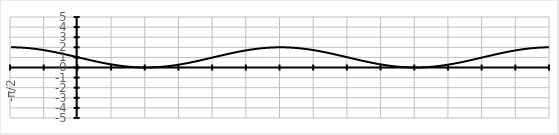
| Category | Series 0 |
|---|---|
| -π/2 | 2 |
|  | 2 |
|  | 1.999 |
|  | 1.999 |
|  | 1.998 |
|  | 1.996 |
|  | 1.995 |
|  | 1.993 |
|  | 1.99 |
|  | 1.988 |
|  | 1.985 |
|  | 1.982 |
|  | 1.978 |
|  | 1.974 |
|  | 1.97 |
|  | 1.966 |
|  | 1.961 |
|  | 1.956 |
|  | 1.951 |
|  | 1.946 |
|  | 1.94 |
|  | 1.934 |
|  | 1.927 |
|  | 1.921 |
|  | 1.914 |
|  | 1.906 |
|  | 1.899 |
|  | 1.891 |
|  | 1.883 |
|  | 1.875 |
|  | 1.866 |
|  | 1.857 |
|  | 1.848 |
|  | 1.839 |
|  | 1.829 |
|  | 1.819 |
|  | 1.809 |
|  | 1.799 |
|  | 1.788 |
|  | 1.777 |
|  | 1.766 |
|  | 1.755 |
|  | 1.743 |
|  | 1.731 |
|  | 1.719 |
|   | 1.707 |
|  | 1.695 |
|  | 1.682 |
|  | 1.669 |
|  | 1.656 |
|  | 1.643 |
|  | 1.629 |
|  | 1.616 |
|  | 1.602 |
|  | 1.588 |
|  | 1.574 |
|  | 1.559 |
|  | 1.545 |
|  | 1.53 |
|  | 1.515 |
|  | 1.5 |
|  | 1.485 |
|  | 1.469 |
|  | 1.454 |
|  | 1.438 |
|  | 1.423 |
|  | 1.407 |
|  | 1.391 |
|  | 1.375 |
|  | 1.358 |
|  | 1.342 |
|  | 1.326 |
|  | 1.309 |
|  | 1.292 |
|  | 1.276 |
|  | 1.259 |
|  | 1.242 |
|  | 1.225 |
|  | 1.208 |
|  | 1.191 |
|  | 1.174 |
|  | 1.156 |
|  | 1.139 |
|  | 1.122 |
|  | 1.105 |
|  | 1.087 |
|  | 1.07 |
|  | 1.052 |
|  | 1.035 |
|  | 1.017 |
| 0 | 1 |
|  | 0.983 |
|  | 0.965 |
|  | 0.948 |
|  | 0.93 |
|  | 0.913 |
|  | 0.895 |
|  | 0.878 |
|  | 0.861 |
|  | 0.844 |
|  | 0.826 |
|  | 0.809 |
|  | 0.792 |
|  | 0.775 |
|  | 0.758 |
|  | 0.741 |
|  | 0.724 |
|  | 0.708 |
|  | 0.691 |
|  | 0.674 |
|  | 0.658 |
|  | 0.642 |
|  | 0.625 |
|  | 0.609 |
|  | 0.593 |
|  | 0.577 |
|  | 0.562 |
|  | 0.546 |
|  | 0.531 |
|  | 0.515 |
|  | 0.5 |
|  | 0.485 |
|  | 0.47 |
|  | 0.455 |
|  | 0.441 |
|  | 0.426 |
|  | 0.412 |
|  | 0.398 |
|  | 0.384 |
|  | 0.371 |
|  | 0.357 |
|  | 0.344 |
|  | 0.331 |
|  | 0.318 |
|  | 0.305 |
|   | 0.293 |
|  | 0.281 |
|  | 0.269 |
|  | 0.257 |
|  | 0.245 |
|  | 0.234 |
|  | 0.223 |
|  | 0.212 |
|  | 0.201 |
|  | 0.191 |
|  | 0.181 |
|  | 0.171 |
|  | 0.161 |
|  | 0.152 |
|  | 0.143 |
|  | 0.134 |
|  | 0.125 |
|  | 0.117 |
|  | 0.109 |
|  | 0.101 |
|  | 0.094 |
|  | 0.086 |
|  | 0.079 |
|  | 0.073 |
|  | 0.066 |
|  | 0.06 |
|  | 0.054 |
|  | 0.049 |
|  | 0.044 |
|  | 0.039 |
|  | 0.034 |
|  | 0.03 |
|  | 0.026 |
|  | 0.022 |
|  | 0.018 |
|  | 0.015 |
|  | 0.012 |
|  | 0.01 |
|  | 0.007 |
|  | 0.005 |
|  | 0.004 |
|  | 0.002 |
|  | 0.001 |
|  | 0.001 |
|  | 0 |
| π/2 | 0 |
|  | 0 |
|  | 0.001 |
|  | 0.001 |
|  | 0.002 |
|  | 0.004 |
|  | 0.005 |
|  | 0.007 |
|  | 0.01 |
|  | 0.012 |
|  | 0.015 |
|  | 0.018 |
|  | 0.022 |
|  | 0.026 |
|  | 0.03 |
|  | 0.034 |
|  | 0.039 |
|  | 0.044 |
|  | 0.049 |
|  | 0.054 |
|  | 0.06 |
|  | 0.066 |
|  | 0.073 |
|  | 0.079 |
|  | 0.086 |
|  | 0.094 |
|  | 0.101 |
|  | 0.109 |
|  | 0.117 |
|  | 0.125 |
|  | 0.134 |
|  | 0.143 |
|  | 0.152 |
|  | 0.161 |
|  | 0.171 |
|  | 0.181 |
|  | 0.191 |
|  | 0.201 |
|  | 0.212 |
|  | 0.223 |
|  | 0.234 |
|  | 0.245 |
|  | 0.257 |
|  | 0.269 |
|  | 0.281 |
|   | 0.293 |
|  | 0.305 |
|  | 0.318 |
|  | 0.331 |
|  | 0.344 |
|  | 0.357 |
|  | 0.371 |
|  | 0.384 |
|  | 0.398 |
|  | 0.412 |
|  | 0.426 |
|  | 0.441 |
|  | 0.455 |
|  | 0.47 |
|  | 0.485 |
|  | 0.5 |
|  | 0.515 |
|  | 0.531 |
|  | 0.546 |
|  | 0.562 |
|  | 0.577 |
|  | 0.593 |
|  | 0.609 |
|  | 0.625 |
|  | 0.642 |
|  | 0.658 |
|  | 0.674 |
|  | 0.691 |
|  | 0.708 |
|  | 0.724 |
|  | 0.741 |
|  | 0.758 |
|  | 0.775 |
|  | 0.792 |
|  | 0.809 |
|  | 0.826 |
|  | 0.844 |
|  | 0.861 |
|  | 0.878 |
|  | 0.895 |
|  | 0.913 |
|  | 0.93 |
|  | 0.948 |
|  | 0.965 |
|  | 0.983 |
| π | 1 |
|  | 1.017 |
|  | 1.035 |
|  | 1.052 |
|  | 1.07 |
|  | 1.087 |
|  | 1.105 |
|  | 1.122 |
|  | 1.139 |
|  | 1.156 |
|  | 1.174 |
|  | 1.191 |
|  | 1.208 |
|  | 1.225 |
|  | 1.242 |
|  | 1.259 |
|  | 1.276 |
|  | 1.292 |
|  | 1.309 |
|  | 1.326 |
|  | 1.342 |
|  | 1.358 |
|  | 1.375 |
|  | 1.391 |
|  | 1.407 |
|  | 1.423 |
|  | 1.438 |
|  | 1.454 |
|  | 1.469 |
|  | 1.485 |
|  | 1.5 |
|  | 1.515 |
|  | 1.53 |
|  | 1.545 |
|  | 1.559 |
|  | 1.574 |
|  | 1.588 |
|  | 1.602 |
|  | 1.616 |
|  | 1.629 |
|  | 1.643 |
|  | 1.656 |
|  | 1.669 |
|  | 1.682 |
|  | 1.695 |
|   | 1.707 |
|  | 1.719 |
|  | 1.731 |
|  | 1.743 |
|  | 1.755 |
|  | 1.766 |
|  | 1.777 |
|  | 1.788 |
|  | 1.799 |
|  | 1.809 |
|  | 1.819 |
|  | 1.829 |
|  | 1.839 |
|  | 1.848 |
|  | 1.857 |
|  | 1.866 |
|  | 1.875 |
|  | 1.883 |
|  | 1.891 |
|  | 1.899 |
|  | 1.906 |
|  | 1.914 |
|  | 1.921 |
|  | 1.927 |
|  | 1.934 |
|  | 1.94 |
|  | 1.946 |
|  | 1.951 |
|  | 1.956 |
|  | 1.961 |
|  | 1.966 |
|  | 1.97 |
|  | 1.974 |
|  | 1.978 |
|  | 1.982 |
|  | 1.985 |
|  | 1.988 |
|  | 1.99 |
|  | 1.993 |
|  | 1.995 |
|  | 1.996 |
|  | 1.998 |
|  | 1.999 |
|  | 1.999 |
|  | 2 |
| 3π/2 | 2 |
|  | 2 |
|  | 1.999 |
|  | 1.999 |
|  | 1.998 |
|  | 1.996 |
|  | 1.995 |
|  | 1.993 |
|  | 1.99 |
|  | 1.988 |
|  | 1.985 |
|  | 1.982 |
|  | 1.978 |
|  | 1.974 |
|  | 1.97 |
|  | 1.966 |
|  | 1.961 |
|  | 1.956 |
|  | 1.951 |
|  | 1.946 |
|  | 1.94 |
|  | 1.934 |
|  | 1.927 |
|  | 1.921 |
|  | 1.914 |
|  | 1.906 |
|  | 1.899 |
|  | 1.891 |
|  | 1.883 |
|  | 1.875 |
|  | 1.866 |
|  | 1.857 |
|  | 1.848 |
|  | 1.839 |
|  | 1.829 |
|  | 1.819 |
|  | 1.809 |
|  | 1.799 |
|  | 1.788 |
|  | 1.777 |
|  | 1.766 |
|  | 1.755 |
|  | 1.743 |
|  | 1.731 |
|  | 1.719 |
|   | 1.707 |
|  | 1.695 |
|  | 1.682 |
|  | 1.669 |
|  | 1.656 |
|  | 1.643 |
|  | 1.629 |
|  | 1.616 |
|  | 1.602 |
|  | 1.588 |
|  | 1.574 |
|  | 1.559 |
|  | 1.545 |
|  | 1.53 |
|  | 1.515 |
|  | 1.5 |
|  | 1.485 |
|  | 1.469 |
|  | 1.454 |
|  | 1.438 |
|  | 1.423 |
|  | 1.407 |
|  | 1.391 |
|  | 1.375 |
|  | 1.358 |
|  | 1.342 |
|  | 1.326 |
|  | 1.309 |
|  | 1.292 |
|  | 1.276 |
|  | 1.259 |
|  | 1.242 |
|  | 1.225 |
|  | 1.208 |
|  | 1.191 |
|  | 1.174 |
|  | 1.156 |
|  | 1.139 |
|  | 1.122 |
|  | 1.105 |
|  | 1.087 |
|  | 1.07 |
|  | 1.052 |
|  | 1.035 |
|  | 1.017 |
| 2π | 1 |
|  | 0.983 |
|  | 0.965 |
|  | 0.948 |
|  | 0.93 |
|  | 0.913 |
|  | 0.895 |
|  | 0.878 |
|  | 0.861 |
|  | 0.844 |
|  | 0.826 |
|  | 0.809 |
|  | 0.792 |
|  | 0.775 |
|  | 0.758 |
|  | 0.741 |
|  | 0.724 |
|  | 0.708 |
|  | 0.691 |
|  | 0.674 |
|  | 0.658 |
|  | 0.642 |
|  | 0.625 |
|  | 0.609 |
|  | 0.593 |
|  | 0.577 |
|  | 0.562 |
|  | 0.546 |
|  | 0.531 |
|  | 0.515 |
|  | 0.5 |
|  | 0.485 |
|  | 0.47 |
|  | 0.455 |
|  | 0.441 |
|  | 0.426 |
|  | 0.412 |
|  | 0.398 |
|  | 0.384 |
|  | 0.371 |
|  | 0.357 |
|  | 0.344 |
|  | 0.331 |
|  | 0.318 |
|  | 0.305 |
|   | 0.293 |
|  | 0.281 |
|  | 0.269 |
|  | 0.257 |
|  | 0.245 |
|  | 0.234 |
|  | 0.223 |
|  | 0.212 |
|  | 0.201 |
|  | 0.191 |
|  | 0.181 |
|  | 0.171 |
|  | 0.161 |
|  | 0.152 |
|  | 0.143 |
|  | 0.134 |
|  | 0.125 |
|  | 0.117 |
|  | 0.109 |
|  | 0.101 |
|  | 0.094 |
|  | 0.086 |
|  | 0.079 |
|  | 0.073 |
|  | 0.066 |
|  | 0.06 |
|  | 0.054 |
|  | 0.049 |
|  | 0.044 |
|  | 0.039 |
|  | 0.034 |
|  | 0.03 |
|  | 0.026 |
|  | 0.022 |
|  | 0.018 |
|  | 0.015 |
|  | 0.012 |
|  | 0.01 |
|  | 0.007 |
|  | 0.005 |
|  | 0.004 |
|  | 0.002 |
|  | 0.001 |
|  | 0.001 |
|  | 0 |
| 5π/2 | 0 |
|  | 0 |
|  | 0.001 |
|  | 0.001 |
|  | 0.002 |
|  | 0.004 |
|  | 0.005 |
|  | 0.007 |
|  | 0.01 |
|  | 0.012 |
|  | 0.015 |
|  | 0.018 |
|  | 0.022 |
|  | 0.026 |
|  | 0.03 |
|  | 0.034 |
|  | 0.039 |
|  | 0.044 |
|  | 0.049 |
|  | 0.054 |
|  | 0.06 |
|  | 0.066 |
|  | 0.073 |
|  | 0.079 |
|  | 0.086 |
|  | 0.094 |
|  | 0.101 |
|  | 0.109 |
|  | 0.117 |
|  | 0.125 |
|  | 0.134 |
|  | 0.143 |
|  | 0.152 |
|  | 0.161 |
|  | 0.171 |
|  | 0.181 |
|  | 0.191 |
|  | 0.201 |
|  | 0.212 |
|  | 0.223 |
|  | 0.234 |
|  | 0.245 |
|  | 0.257 |
|  | 0.269 |
|  | 0.281 |
|   | 0.293 |
|  | 0.305 |
|  | 0.318 |
|  | 0.331 |
|  | 0.344 |
|  | 0.357 |
|  | 0.371 |
|  | 0.384 |
|  | 0.398 |
|  | 0.412 |
|  | 0.426 |
|  | 0.441 |
|  | 0.455 |
|  | 0.47 |
|  | 0.485 |
|  | 0.5 |
|  | 0.515 |
|  | 0.531 |
|  | 0.546 |
|  | 0.562 |
|  | 0.577 |
|  | 0.593 |
|  | 0.609 |
|  | 0.625 |
|  | 0.642 |
|  | 0.658 |
|  | 0.674 |
|  | 0.691 |
|  | 0.708 |
|  | 0.724 |
|  | 0.741 |
|  | 0.758 |
|  | 0.775 |
|  | 0.792 |
|  | 0.809 |
|  | 0.826 |
|  | 0.844 |
|  | 0.861 |
|  | 0.878 |
|  | 0.895 |
|  | 0.913 |
|  | 0.93 |
|  | 0.948 |
|  | 0.965 |
|  | 0.983 |
| 3π | 1 |
|  | 1.017 |
|  | 1.035 |
|  | 1.052 |
|  | 1.07 |
|  | 1.087 |
|  | 1.105 |
|  | 1.122 |
|  | 1.139 |
|  | 1.156 |
|  | 1.174 |
|  | 1.191 |
|  | 1.208 |
|  | 1.225 |
|  | 1.242 |
|  | 1.259 |
|  | 1.276 |
|  | 1.292 |
|  | 1.309 |
|  | 1.326 |
|  | 1.342 |
|  | 1.358 |
|  | 1.375 |
|  | 1.391 |
|  | 1.407 |
|  | 1.423 |
|  | 1.438 |
|  | 1.454 |
|  | 1.469 |
|  | 1.485 |
|  | 1.5 |
|  | 1.515 |
|  | 1.53 |
|  | 1.545 |
|  | 1.559 |
|  | 1.574 |
|  | 1.588 |
|  | 1.602 |
|  | 1.616 |
|  | 1.629 |
|  | 1.643 |
|  | 1.656 |
|  | 1.669 |
|  | 1.682 |
|  | 1.695 |
|   | 1.707 |
|  | 1.719 |
|  | 1.731 |
|  | 1.743 |
|  | 1.755 |
|  | 1.766 |
|  | 1.777 |
|  | 1.788 |
|  | 1.799 |
|  | 1.809 |
|  | 1.819 |
|  | 1.829 |
|  | 1.839 |
|  | 1.848 |
|  | 1.857 |
|  | 1.866 |
|  | 1.875 |
|  | 1.883 |
|  | 1.891 |
|  | 1.899 |
|  | 1.906 |
|  | 1.914 |
|  | 1.921 |
|  | 1.927 |
|  | 1.934 |
|  | 1.94 |
|  | 1.946 |
|  | 1.951 |
|  | 1.956 |
|  | 1.961 |
|  | 1.966 |
|  | 1.97 |
|  | 1.974 |
|  | 1.978 |
|  | 1.982 |
|  | 1.985 |
|  | 1.988 |
|  | 1.99 |
|  | 1.993 |
|  | 1.995 |
|  | 1.996 |
|  | 1.998 |
|  | 1.999 |
|  | 1.999 |
|  | 2 |
| 7π/2 | 2 |